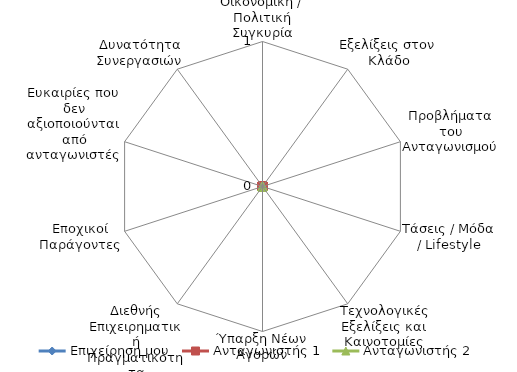
| Category | Επιχείρηση μου | Ανταγωνιστής 1 | Ανταγωνιστής 2 |
|---|---|---|---|
| Οικονομική / Πολιτική Συγκυρία | 2 | 1 | 1 |
| Εξελίξεις στον Κλάδο | 2 | 1 | 1 |
| Προβλήματα του Ανταγωνισμού | 2 | 5 | 5 |
| Τάσεις / Μόδα / Lifestyle | 1 | 5 | 4 |
| Τεχνολογικές Εξελίξεις και Καινοτομίες | 1 | 5 | 1 |
| Ύπαρξη Νέων Αγορών | 1 | 5 | 1 |
| Διεθνής Επιχειρηματική Πραγματικότητα | 3 | 2 | 5 |
| Εποχικοί Παράγοντες | 1 | 1 | 3 |
| Ευκαιρίες που δεν αξιοποιούνται από ανταγωνιστές | 4 | 4 | 1 |
| Δυνατότητα Συνεργασιών | 1 | 5 | 4 |